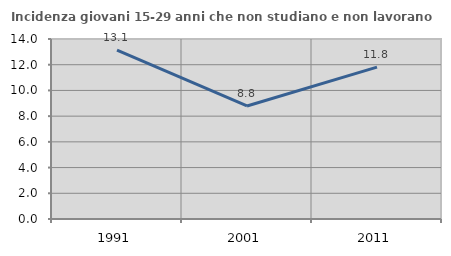
| Category | Incidenza giovani 15-29 anni che non studiano e non lavorano  |
|---|---|
| 1991.0 | 13.133 |
| 2001.0 | 8.793 |
| 2011.0 | 11.814 |